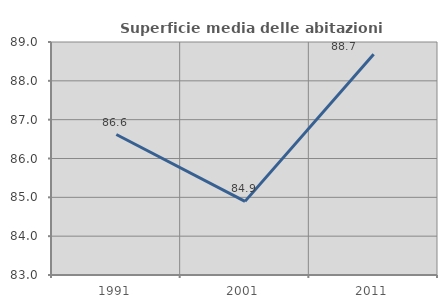
| Category | Superficie media delle abitazioni occupate |
|---|---|
| 1991.0 | 86.618 |
| 2001.0 | 84.896 |
| 2011.0 | 88.682 |